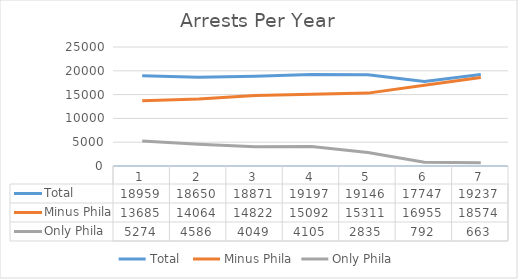
| Category | Total  | Minus Phila | Only Phila |
|---|---|---|---|
| 0 | 18959 | 13685 | 5274 |
| 1 | 18650 | 14064 | 4586 |
| 2 | 18871 | 14822 | 4049 |
| 3 | 19197 | 15092 | 4105 |
| 4 | 19146 | 15311 | 2835 |
| 5 | 17747 | 16955 | 792 |
| 6 | 19237 | 18574 | 663 |